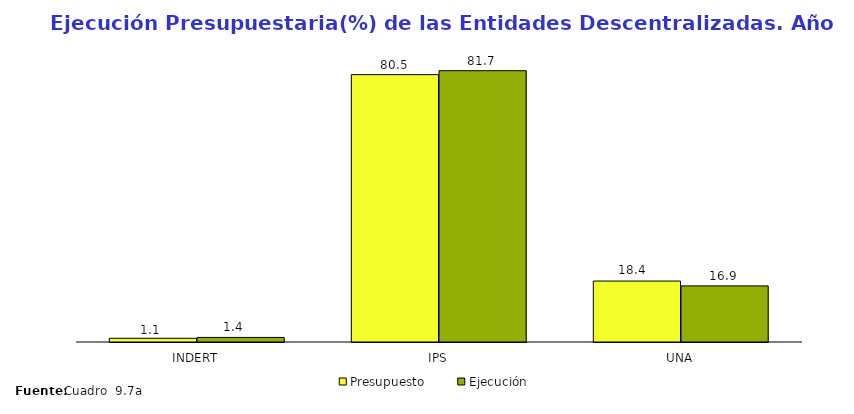
| Category | Presupuesto | Ejecución |
|---|---|---|
| INDERT | 1.118 | 1.376 |
| IPS | 80.527 | 81.719 |
| UNA | 18.355 | 16.905 |